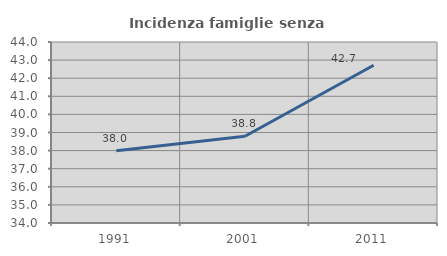
| Category | Incidenza famiglie senza nuclei |
|---|---|
| 1991.0 | 37.994 |
| 2001.0 | 38.79 |
| 2011.0 | 42.715 |